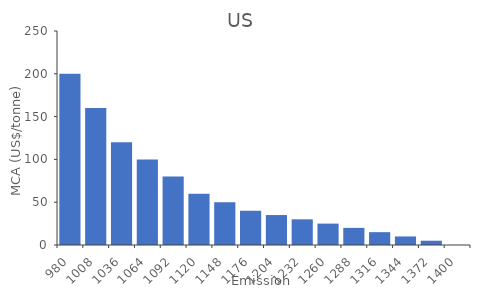
| Category | TCA (million $) |
|---|---|
| 980.0 | 200 |
| 1008.0 | 160 |
| 1036.0 | 120 |
| 1064.0 | 100 |
| 1092.0 | 80 |
| 1120.0 | 60 |
| 1148.0 | 50 |
| 1176.0 | 40 |
| 1204.0 | 35 |
| 1232.0 | 30 |
| 1260.0 | 25 |
| 1288.0 | 20 |
| 1316.0 | 15 |
| 1344.0 | 10 |
| 1372.0 | 5 |
| 1400.0 | 0 |